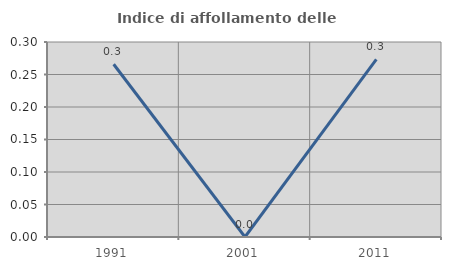
| Category | Indice di affollamento delle abitazioni  |
|---|---|
| 1991.0 | 0.266 |
| 2001.0 | 0 |
| 2011.0 | 0.273 |